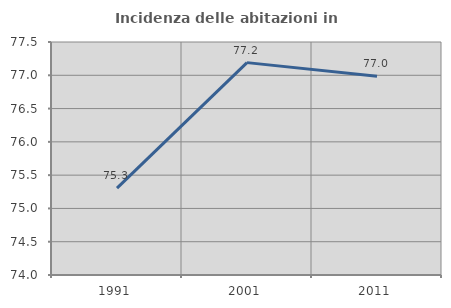
| Category | Incidenza delle abitazioni in proprietà  |
|---|---|
| 1991.0 | 75.304 |
| 2001.0 | 77.19 |
| 2011.0 | 76.985 |